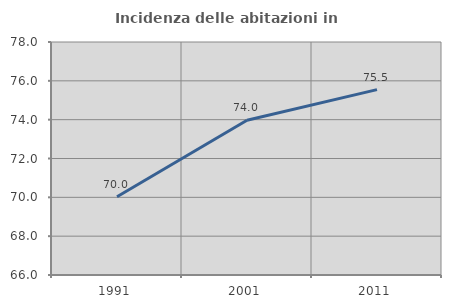
| Category | Incidenza delle abitazioni in proprietà  |
|---|---|
| 1991.0 | 70.027 |
| 2001.0 | 73.967 |
| 2011.0 | 75.549 |